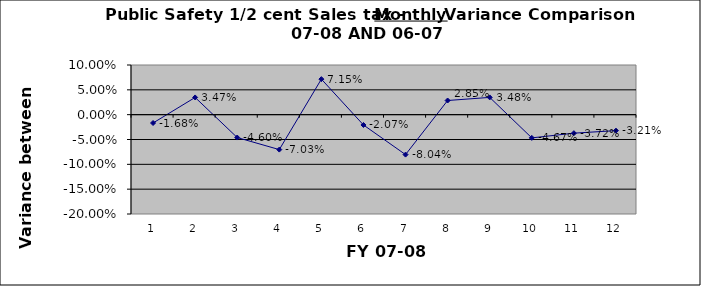
| Category | September October November December January February March April May June  July August |
|---|---|
| 0 | -0.017 |
| 1 | 0.035 |
| 2 | -0.046 |
| 3 | -0.07 |
| 4 | 0.072 |
| 5 | -0.021 |
| 6 | -0.08 |
| 7 | 0.028 |
| 8 | 0.035 |
| 9 | -0.047 |
| 10 | -0.037 |
| 11 | -0.032 |